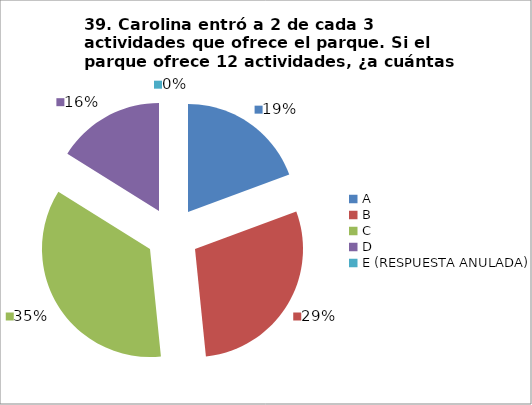
| Category | CANTIDAD DE RESPUESTAS PREGUNTA (39) | PORCENTAJE |
|---|---|---|
| A | 6 | 0.194 |
| B | 9 | 0.29 |
| C | 11 | 0.355 |
| D | 5 | 0.161 |
| E (RESPUESTA ANULADA) | 0 | 0 |